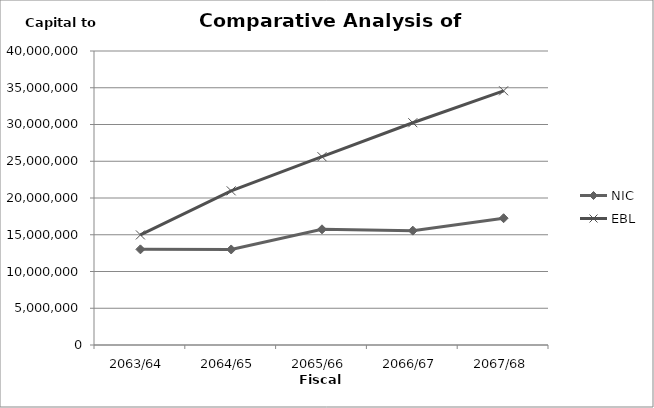
| Category | NIC | EBL |
|---|---|---|
| 2063/64 | 13012737.71 | 14976737 |
| 2064/65 | 12998509.04 | 20974862 |
| 2065/66 | 15741613.92 | 25619753 |
| 2066/67 | 15559349.7 | 30240428 |
| 2067/68 | 17250711.43 | 34583547 |